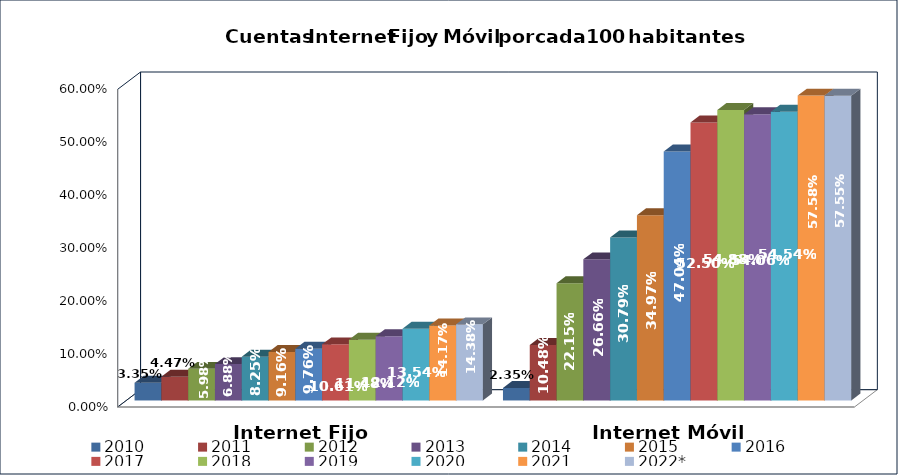
| Category | 2010 | 2011 | 2012 | 2013 | 2014 | 2015 | 2016 | 2017 | 2018 | 2019 | 2020 | 2021 | 2022* |
|---|---|---|---|---|---|---|---|---|---|---|---|---|---|
| Internet Fijo | 0.033 | 0.045 | 0.06 | 0.069 | 0.083 | 0.092 | 0.098 | 0.106 | 0.115 | 0.121 | 0.135 | 0.142 | 0.144 |
| Internet Móvil | 0.024 | 0.105 | 0.222 | 0.267 | 0.308 | 0.35 | 0.47 | 0.525 | 0.549 | 0.541 | 0.545 | 0.576 | 0.575 |